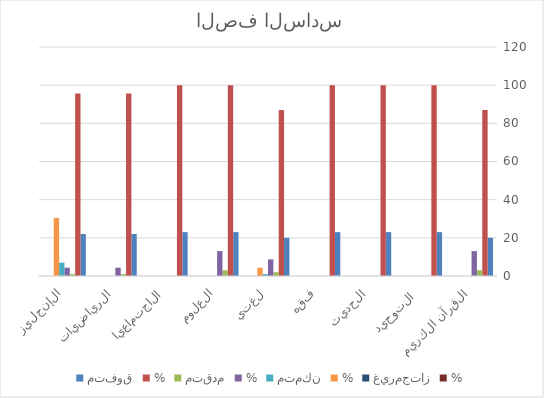
| Category | متفوق | % | متقدم | متمكن | غيرمجتاز |
|---|---|---|---|---|---|
| القرآن الكريم | 20 | 0 | 3 | 0 | 0 |
| التوحيد  | 23 | 0 | 0 | 0 | 0 |
| الحديث | 23 | 0 | 0 | 0 | 0 |
| فقه | 23 | 0 | 0 | 0 | 0 |
| لغتي | 20 | 0 | 2 | 1 | 0 |
| العلوم | 23 | 0 | 3 | 0 | 0 |
| الاجتماعيات | 23 | 0 | 0 | 0 | 0 |
| الرياضيات | 22 | 0 | 1 | 0 | 0 |
| الإنجليزي | 22 | 0 | 1 | 7 | 0 |